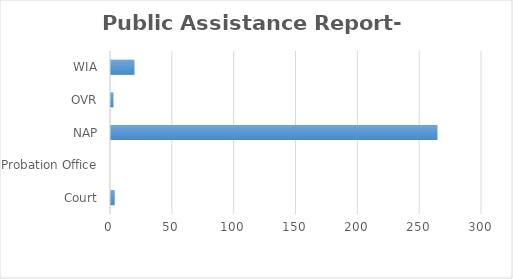
| Category | Series 0 |
|---|---|
| Court | 3 |
| Probation Office | 0 |
| NAP | 264 |
| OVR | 2 |
| WIA | 19 |